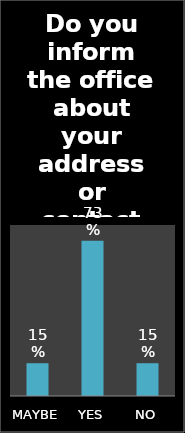
| Category | Series 0 |
|---|---|
| MAYBE | 0.153 |
| YES | 0.727 |
| NO | 0.153 |